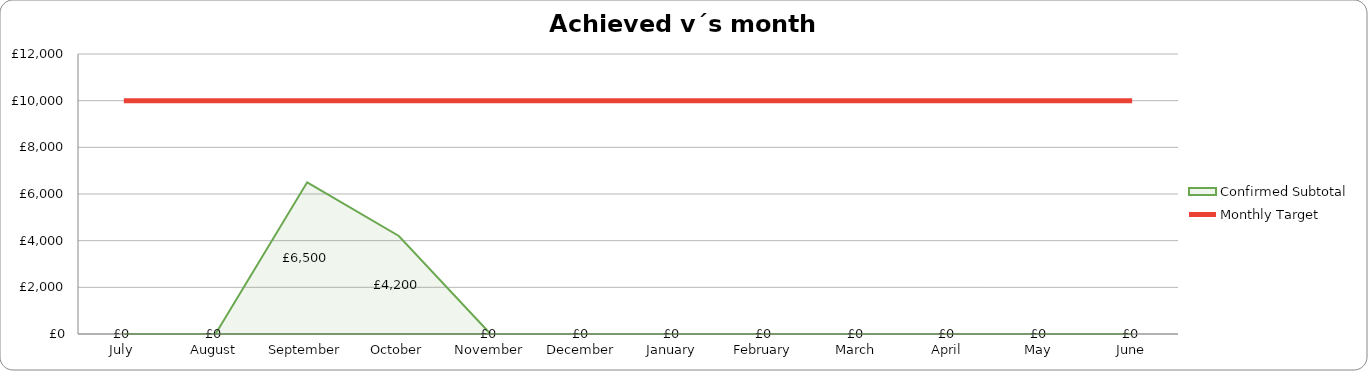
| Category | Monthly Target |
|---|---|
| 2019-07-01 | 10000 |
| 2019-08-01 | 10000 |
| 2019-09-01 | 10000 |
| 2019-10-01 | 10000 |
| 2019-11-01 | 10000 |
| 2019-12-01 | 10000 |
| 2020-01-01 | 10000 |
| 2020-02-01 | 10000 |
| 2020-03-01 | 10000 |
| 2020-04-01 | 10000 |
| 2020-05-01 | 10000 |
| 2020-06-01 | 10000 |